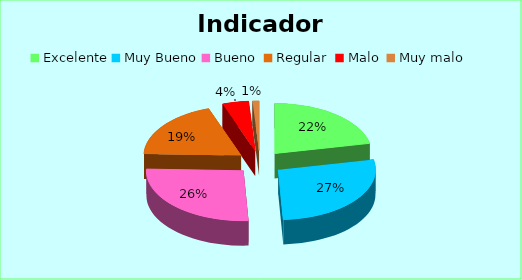
| Category | Series 0 |
|---|---|
| Excelente | 0.217 |
| Muy Bueno | 0.274 |
| Bueno  | 0.264 |
| Regular  | 0.19 |
| Malo  | 0.043 |
| Muy malo  | 0.011 |